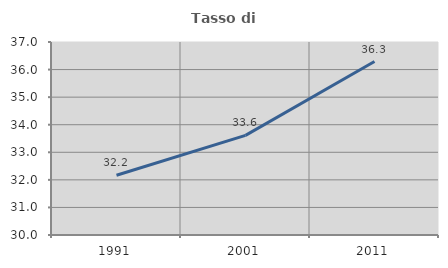
| Category | Tasso di occupazione   |
|---|---|
| 1991.0 | 32.166 |
| 2001.0 | 33.612 |
| 2011.0 | 36.292 |